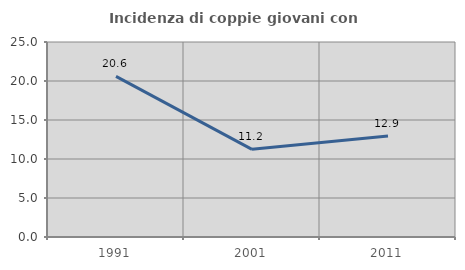
| Category | Incidenza di coppie giovani con figli |
|---|---|
| 1991.0 | 20.588 |
| 2001.0 | 11.239 |
| 2011.0 | 12.946 |